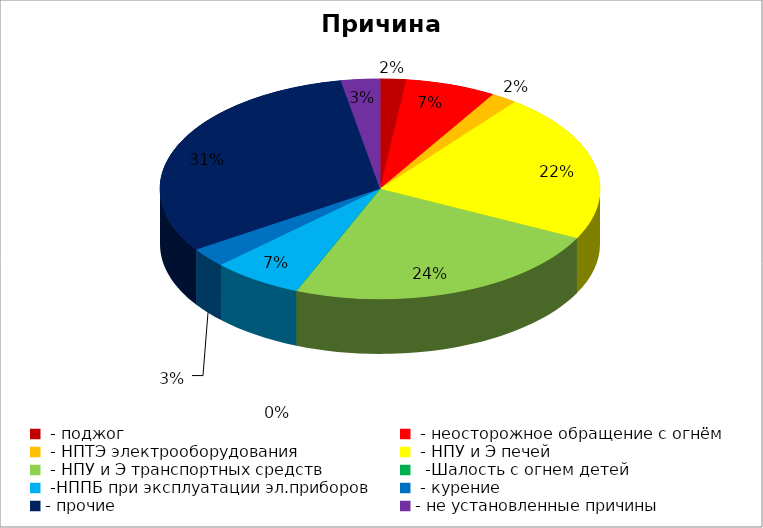
| Category | Причина пожара |
|---|---|
|  - поджог | 2 |
|  - неосторожное обращение с огнём | 7 |
|  - НПТЭ электрооборудования | 2 |
|  - НПУ и Э печей | 23 |
|  - НПУ и Э транспортных средств | 25 |
|   -Шалость с огнем детей | 0 |
|  -НППБ при эксплуатации эл.приборов | 7 |
|  - курение | 3 |
| - прочие | 33 |
| - не установленные причины | 3 |